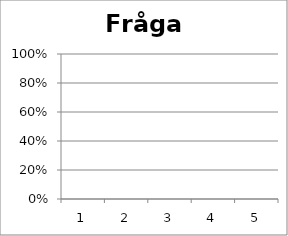
| Category | Fråga 10 |
|---|---|
| 0 | 0 |
| 1 | 0 |
| 2 | 0 |
| 3 | 0 |
| 4 | 0 |